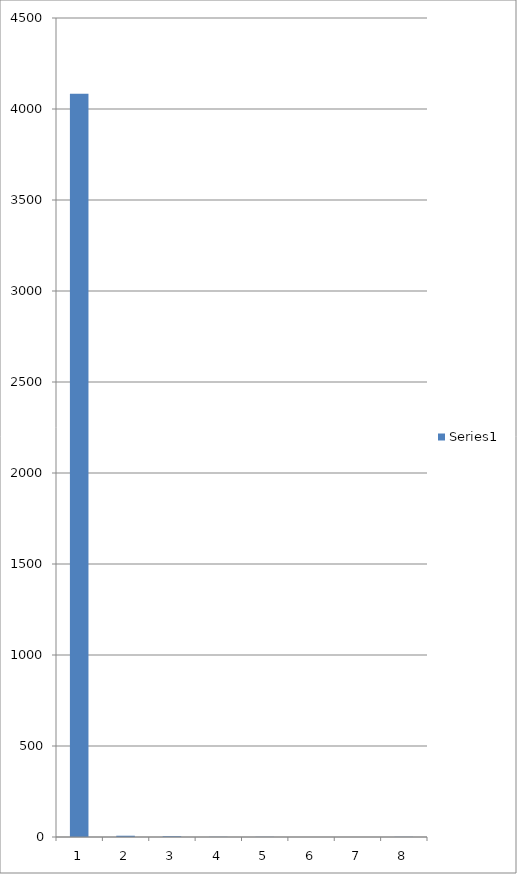
| Category | Series 0 |
|---|---|
| 0 | 4084 |
| 1 | 7 |
| 2 | 4 |
| 3 | 1 |
| 4 | 1 |
| 5 | 0 |
| 6 | 0 |
| 7 | 1 |